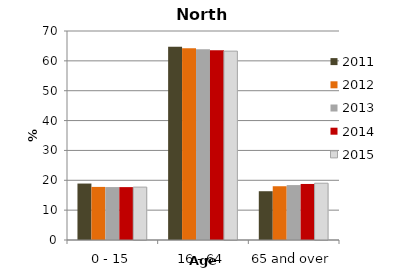
| Category | 2011 | 2012 | 2013 | 2014 | 2015 |
|---|---|---|---|---|---|
| 0 - 15 | 18.907 | 17.78 | 17.729 | 17.713 | 17.717 |
| 16 - 64 | 64.757 | 64.212 | 63.875 | 63.518 | 63.263 |
| 65 and over | 16.337 | 18.007 | 18.396 | 18.768 | 19.02 |